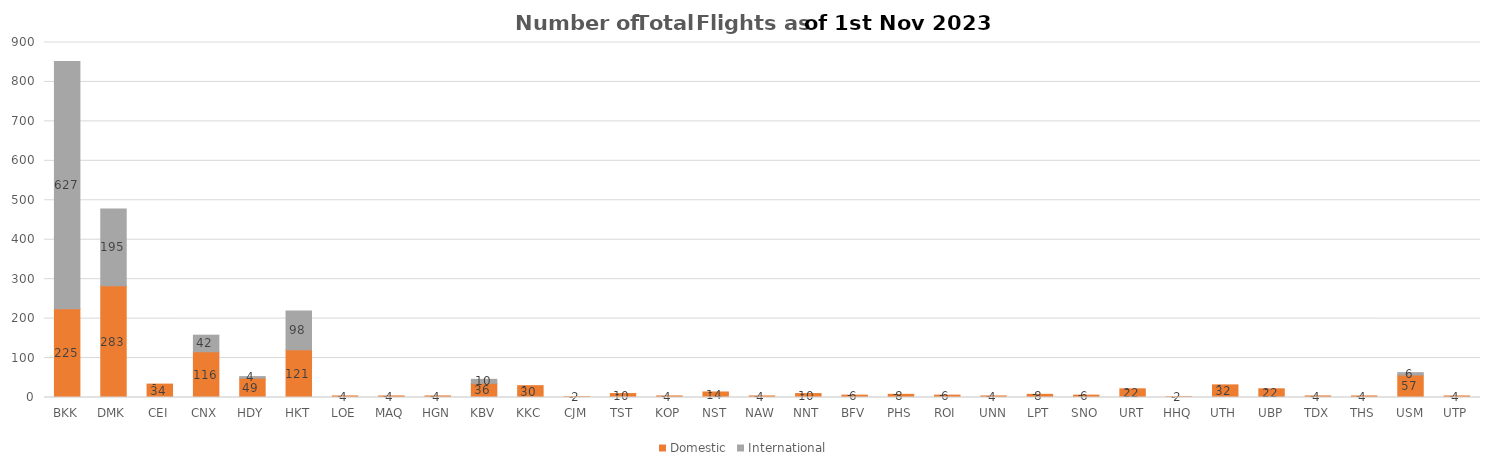
| Category | Domestic | International |
|---|---|---|
| BKK | 225 | 627 |
| DMK | 283 | 195 |
| CEI | 34 | 0 |
| CNX | 116 | 42 |
| HDY | 49 | 4 |
| HKT | 121 | 98 |
| LOE | 4 | 0 |
| MAQ | 4 | 0 |
| HGN | 4 | 0 |
| KBV | 36 | 10 |
| KKC | 30 | 0 |
| CJM | 2 | 0 |
| TST | 10 | 0 |
| KOP | 4 | 0 |
| NST | 14 | 0 |
| NAW | 4 | 0 |
| NNT | 10 | 0 |
| BFV | 6 | 0 |
| PHS | 8 | 0 |
| ROI | 6 | 0 |
| UNN | 4 | 0 |
| LPT | 8 | 0 |
| SNO | 6 | 0 |
| URT | 22 | 0 |
| HHQ | 2 | 0 |
| UTH | 32 | 0 |
| UBP | 22 | 0 |
| TDX | 4 | 0 |
| THS | 4 | 0 |
| USM | 57 | 6 |
| UTP | 4 | 0 |